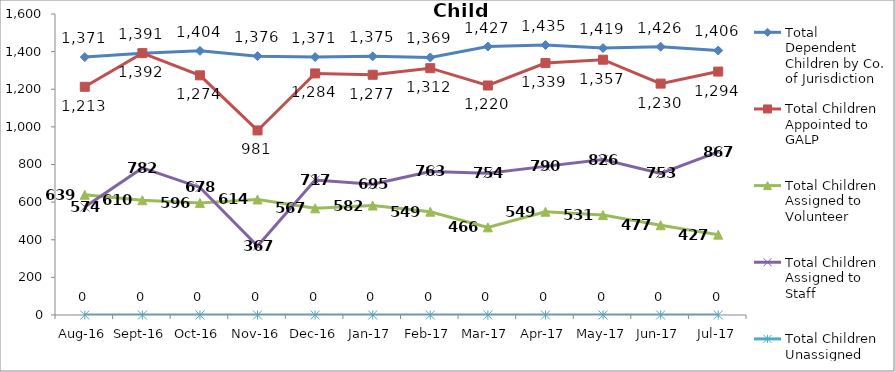
| Category | Total Dependent Children by Co. of Jurisdiction | Total Children Appointed to GALP | Total Children Assigned to Volunteer | Total Children Assigned to Staff | Total Children Unassigned |
|---|---|---|---|---|---|
| Aug-16 | 1371 | 1213 | 639 | 574 | 0 |
| Sep-16 | 1391 | 1392 | 610 | 782 | 0 |
| Oct-16 | 1404 | 1274 | 596 | 678 | 0 |
| Nov-16 | 1376 | 981 | 614 | 367 | 0 |
| Dec-16 | 1371 | 1284 | 567 | 717 | 0 |
| Jan-17 | 1375 | 1277 | 582 | 695 | 0 |
| Feb-17 | 1369 | 1312 | 549 | 763 | 0 |
| Mar-17 | 1427 | 1220 | 466 | 754 | 0 |
| Apr-17 | 1435 | 1339 | 549 | 790 | 0 |
| May-17 | 1419 | 1357 | 531 | 826 | 0 |
| Jun-17 | 1426 | 1230 | 477 | 753 | 0 |
| Jul-17 | 1406 | 1294 | 427 | 867 | 0 |